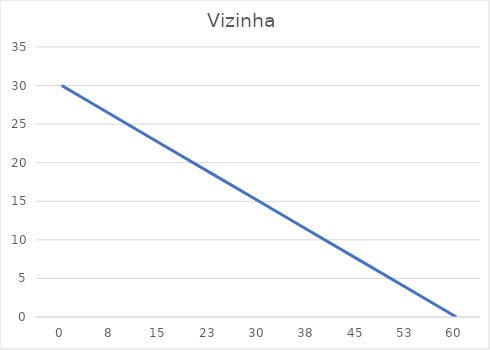
| Category | maça |
|---|---|
| 0.0 | 30 |
| 7.5 | 26.25 |
| 15.0 | 22.5 |
| 22.5 | 18.75 |
| 30.0 | 15 |
| 37.5 | 11.25 |
| 45.0 | 7.5 |
| 52.5 | 3.75 |
| 60.0 | 0 |